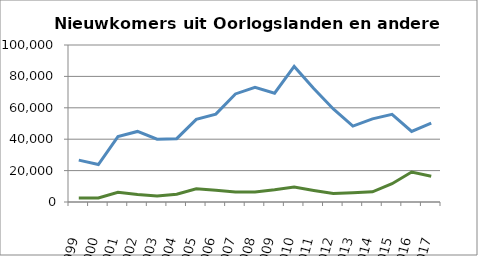
| Category | Oorlogslanden | Ander |
|---|---|---|
| 1999.0 | 2562 | 26687 |
| 2000.0 | 2566 | 23886 |
| 2001.0 | 6241 | 41690 |
| 2002.0 | 4720 | 44937 |
| 2003.0 | 3801 | 40042 |
| 2004.0 | 4896 | 40338 |
| 2005.0 | 8359 | 52664 |
| 2006.0 | 7500 | 55978 |
| 2007.0 | 6410 | 68820 |
| 2008.0 | 6447 | 73001 |
| 2009.0 | 7784 | 69331 |
| 2010.0 | 9509 | 86337 |
| 2011.0 | 7348 | 72268 |
| 2012.0 | 5358 | 59287 |
| 2013.0 | 5889 | 48379 |
| 2014.0 | 6474 | 52942 |
| 2015.0 | 11632 | 55801 |
| 2016.0 | 19103 | 44962 |
| 2017.0 | 16399.5 | 50255.5 |